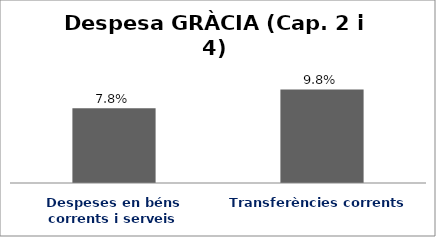
| Category | Series 0 |
|---|---|
| Despeses en béns corrents i serveis | 0.078 |
| Transferències corrents | 0.098 |